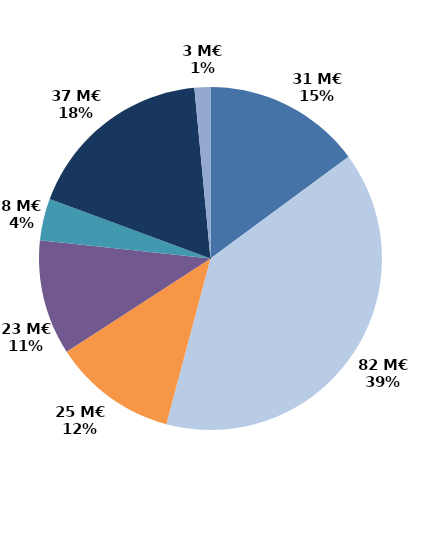
| Category | Series 0 |
|---|---|
| Accueil et information (CEP 1) | 31.219 |
| Accompagnement renforcé (CEP 2 et 3) | 82.375 |
| Suivi | 24.521 |
| Missions locales | 22.75 |
| CSP | 8.293 |
| Aide à la création d'entreprise | 37.468 |
| Aide à l'insertion | 3.147 |